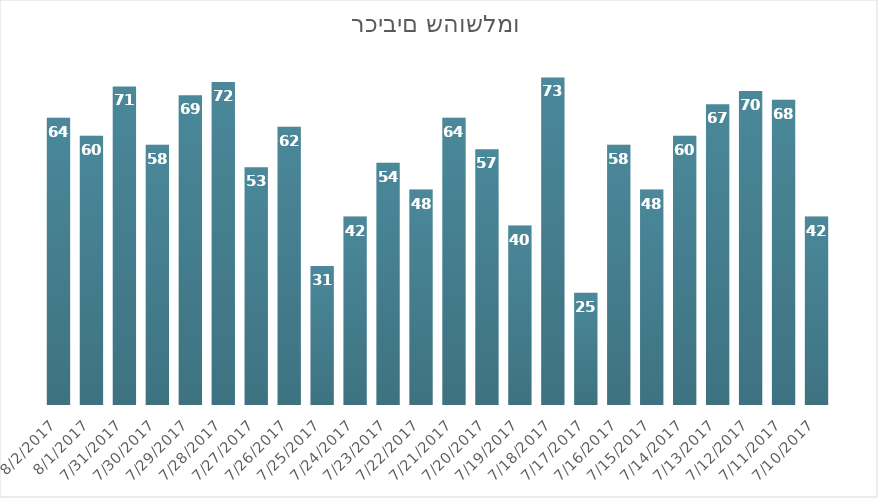
| Category | רכיבים שהושלמו |
|---|---|
| 7/10/17 | 42 |
| 7/11/17 | 68 |
| 7/12/17 | 70 |
| 7/13/17 | 67 |
| 7/14/17 | 60 |
| 7/15/17 | 48 |
| 7/16/17 | 58 |
| 7/17/17 | 25 |
| 7/18/17 | 73 |
| 7/19/17 | 40 |
| 7/20/17 | 57 |
| 7/21/17 | 64 |
| 7/22/17 | 48 |
| 7/23/17 | 54 |
| 7/24/17 | 42 |
| 7/25/17 | 31 |
| 7/26/17 | 62 |
| 7/27/17 | 53 |
| 7/28/17 | 72 |
| 7/29/17 | 69 |
| 7/30/17 | 58 |
| 7/31/17 | 71 |
| 8/1/17 | 60 |
| 8/2/17 | 64 |